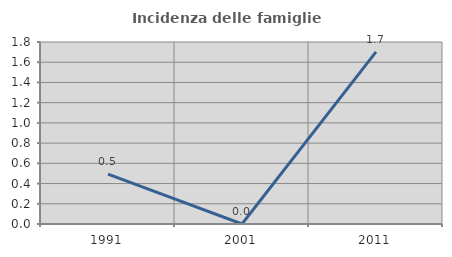
| Category | Incidenza delle famiglie numerose |
|---|---|
| 1991.0 | 0.493 |
| 2001.0 | 0 |
| 2011.0 | 1.702 |